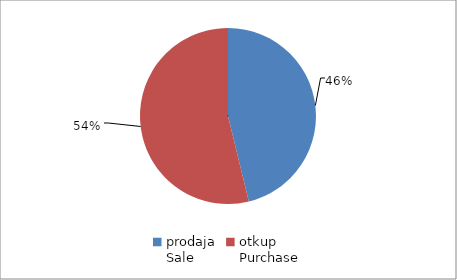
| Category | Series 0 |
|---|---|
| prodaja
Sale | 73228225.8 |
| otkup
Purchase | 85297359.7 |